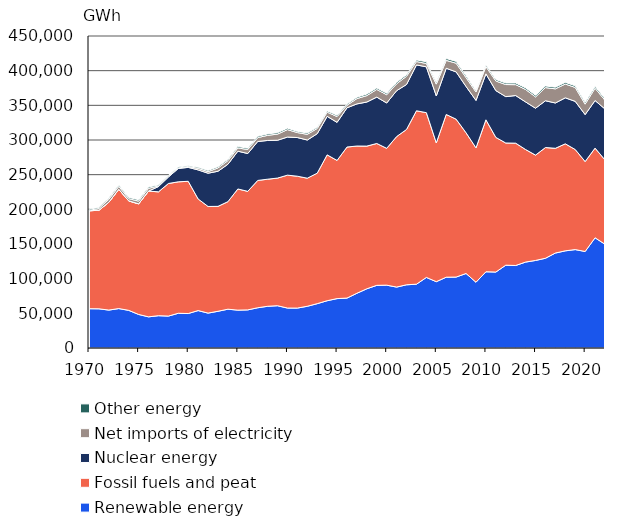
| Category | Renewable energy | Fossil fuels and peat | Nuclear energy | Net imports of electricity | Other energy |
|---|---|---|---|---|---|
| 1970.0 | 56676 | 141251 | 0 | 528 | 1672 |
| 1971.0 | 56498 | 142144 | 0 | 2590 | 1481 |
| 1972.0 | 54693 | 155524 | 0 | 4219 | 1732 |
| 1973.0 | 56869 | 171987 | 0 | 4319 | 1864 |
| 1974.0 | 54304 | 157985 | 0 | 3140 | 1771 |
| 1975.0 | 48406 | 159489 | 0 | 3987 | 1947 |
| 1976.0 | 44933 | 181379 | 0 | 4015 | 1918 |
| 1977.0 | 46592 | 178632 | 7606 | 891 | 1394 |
| 1978.0 | 46012 | 191245 | 9330 | 1277 | 1045 |
| 1979.0 | 50085 | 189606 | 19273 | 649 | 1335 |
| 1980.0 | 49695 | 190761 | 20076 | 1211 | 1275 |
| 1981.0 | 53974 | 160985 | 41924 | 2244 | 1590 |
| 1982.0 | 50311 | 153835 | 47958 | 2314 | 1710 |
| 1983.0 | 52962 | 151337 | 50658 | 4778 | 1765 |
| 1984.0 | 55959 | 155126 | 53936 | 5215 | 1846 |
| 1985.0 | 54617 | 174764 | 54485 | 4727 | 1919 |
| 1986.0 | 54979 | 170952 | 54539 | 5807 | 1892 |
| 1987.0 | 58048 | 183616 | 56164 | 5595 | 1883 |
| 1988.0 | 60156 | 183302 | 55900 | 7385 | 1999 |
| 1989.0 | 60992 | 184085 | 54576 | 8868 | 2055 |
| 1990.0 | 57617 | 191694 | 54933 | 10742 | 2057 |
| 1991.0 | 57566 | 190200 | 55779 | 7184 | 1692 |
| 1992.0 | 60175 | 184734 | 55061 | 8231 | 1909 |
| 1993.0 | 63942 | 188209 | 56970 | 7537 | 1711 |
| 1994.0 | 68181 | 210368 | 55539 | 6078 | 1820 |
| 1995.0 | 71238 | 199267 | 54933 | 8405 | 1884 |
| 1996.0 | 72002 | 217855 | 56603 | 3661 | 1721 |
| 1997.0 | 78965 | 212347 | 60761 | 7653 | 1964 |
| 1998.0 | 85411 | 205799 | 63564 | 9306 | 2173 |
| 1999.0 | 90364 | 204632 | 66849 | 11124 | 2089 |
| 2000.0 | 90620 | 197370 | 65379 | 11880 | 2133 |
| 2001.0 | 87854 | 217064 | 66224 | 9959 | 2156 |
| 2002.0 | 91160 | 224039 | 64833 | 11925 | 2221 |
| 2003.0 | 92032 | 250126 | 66151 | 4852 | 2313 |
| 2004.0 | 101779 | 237647 | 66103 | 4870 | 2440 |
| 2005.0 | 95675 | 200194 | 67746 | 17014 | 2579 |
| 2006.0 | 102102 | 234705 | 66678 | 11401 | 2556 |
| 2007.0 | 102303 | 227733 | 68185 | 12557 | 2612 |
| 2008.0 | 107452 | 202932 | 66817 | 12772 | 2576 |
| 2009.0 | 94870 | 193769 | 68487 | 12085 | 1982 |
| 2010.0 | 109949 | 219162 | 66330 | 10501 | 2363 |
| 2011.0 | 109545 | 194207 | 67471 | 13851 | 2177 |
| 2012.0 | 119433 | 176261 | 66857 | 17443 | 2115 |
| 2013.0 | 119004 | 176416 | 68708 | 15715 | 2308 |
| 2014.0 | 123929 | 162325 | 68624 | 17966 | 2326 |
| 2015.0 | 126289 | 151905 | 67654 | 16337 | 2296 |
| 2016.0 | 129440 | 159676 | 67516 | 18951 | 2291 |
| 2017.0 | 136936 | 151087 | 65376 | 20426 | 2302 |
| 2018.0 | 140140 | 154359 | 66306 | 19936 | 2365 |
| 2019.0 | 141946 | 144353 | 69439 | 20042 | 2285 |
| 2020.0 | 139186 | 129730 | 67740 | 15105 | 2609 |
| 2021.0 | 158950 | 129345 | 68624 | 17768 | 2582 |
| 2022.0 | 149614 | 121641 | 73461 | 12518 | 2281 |